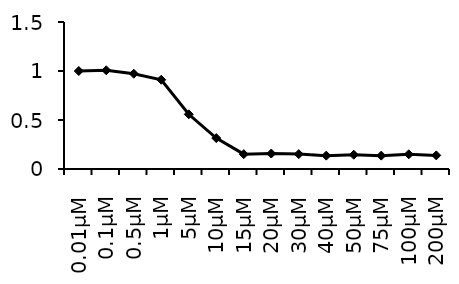
| Category | Series 0 |
|---|---|
| 0.01μM | 1 |
| 0.1μM | 1.007 |
| 0.5μM | 0.972 |
| 1μM | 0.911 |
| 5μM | 0.558 |
| 10μM | 0.316 |
| 15μM | 0.151 |
| 20μM | 0.158 |
| 30μM | 0.152 |
| 40μM | 0.136 |
| 50μM | 0.145 |
| 75μM | 0.136 |
| 100μM | 0.15 |
| 200μM | 0.139 |